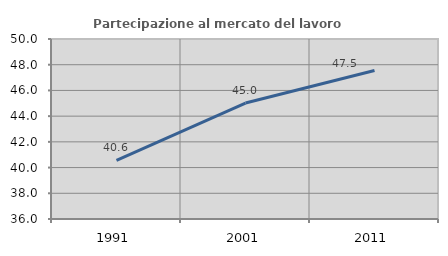
| Category | Partecipazione al mercato del lavoro  femminile |
|---|---|
| 1991.0 | 40.55 |
| 2001.0 | 45.021 |
| 2011.0 | 47.545 |